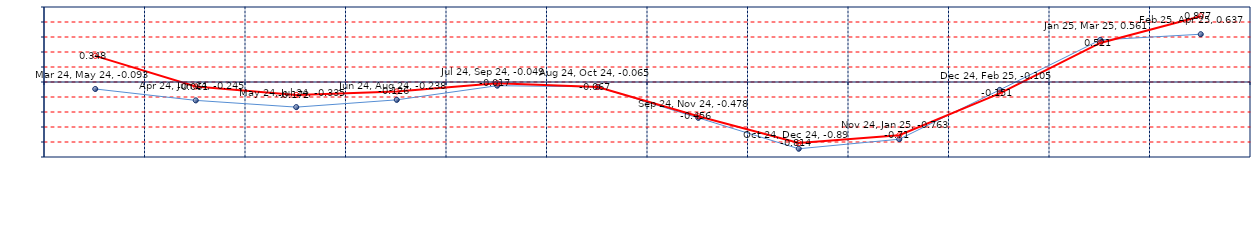
| Category | Last | Historical |
|---|---|---|
| Mar 24, May 24 | -0.093 | 0.348 |
| Apr 24, Jun 24 | -0.245 | -0.061 |
| May 24, Jul 24 | -0.335 | -0.172 |
| Jun 24, Aug 24 | -0.238 | -0.126 |
| Jul 24, Sep 24 | -0.049 | -0.017 |
| Aug 24, Oct 24 | -0.065 | -0.067 |
| Sep 24, Nov 24 | -0.478 | -0.456 |
| Oct 24, Dec 24 | -0.89 | -0.814 |
| Nov 24, Jan 25 | -0.763 | -0.71 |
| Dec 24, Feb 25 | -0.105 | -0.151 |
| Jan 25, Mar 25 | 0.561 | 0.521 |
| Feb 25, Apr 25 | 0.637 | 0.877 |